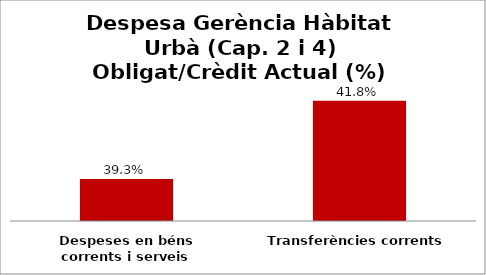
| Category | Series 0 |
|---|---|
| Despeses en béns corrents i serveis | 0.393 |
| Transferències corrents | 0.418 |